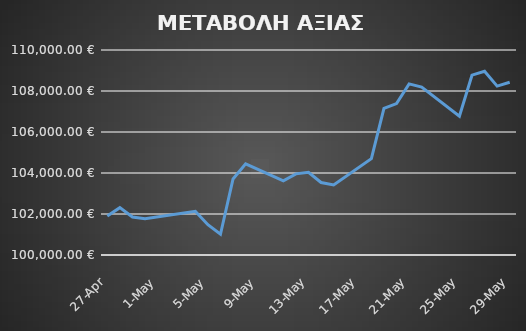
| Category | ΜΕΤΑΒΟΛΗ ΑΞΙΑΣ ΚΕΦΑΛΑΙΟΥ |
|---|---|
| 2015-04-27 | 101899 |
| 2015-04-28 | 102308.65 |
| 2015-04-29 | 101850.899 |
| 2015-04-30 | 101774.395 |
| 2015-05-04 | 102134.712 |
| 2015-05-05 | 101476.817 |
| 2015-05-06 | 101011.582 |
| 2015-05-07 | 103707.138 |
| 2015-05-08 | 104445.818 |
| 2015-05-11 | 103621.96 |
| 2015-05-12 | 103959.091 |
| 2015-05-13 | 104031.682 |
| 2015-05-14 | 103534.734 |
| 2015-05-15 | 103417.508 |
| 2015-05-18 | 104699.033 |
| 2015-05-19 | 107147.698 |
| 2015-05-20 | 107385.563 |
| 2015-05-21 | 108347.963 |
| 2015-05-22 | 108192.915 |
| 2015-05-25 | 106774.686 |
| 2015-05-26 | 108771.443 |
| 2015-05-27 | 108961.786 |
| 2015-05-28 | 108236.924 |
| 2015-05-29 | 108424.861 |